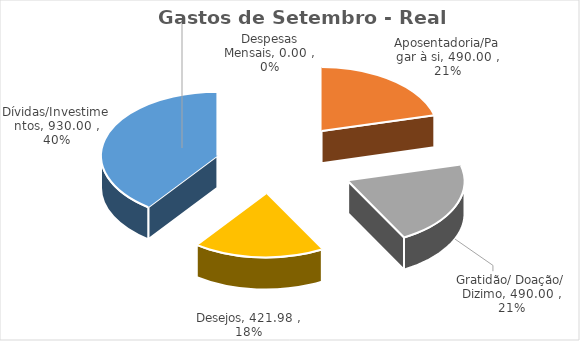
| Category | Gastos de Setembro - Real Acumulado |
|---|---|
| Despesas Mensais | 0 |
| Aposentadoria/Pagar à si | 490 |
| Gratidão/ Doação/ Dizimo | 490 |
| Desejos | 421.98 |
| Dívidas/Investimentos | 930 |